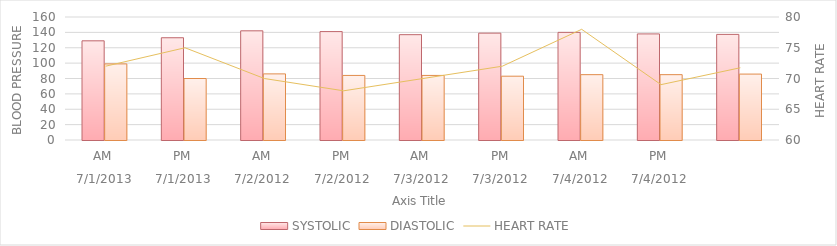
| Category | SYSTOLIC | DIASTOLIC |
|---|---|---|
| 0 | 129 | 99 |
| 1/1/00 | 133 | 80 |
| 1/2/00 | 142 | 86 |
| 1/3/00 | 141 | 84 |
| 1/4/00 | 137 | 84 |
| 1/5/00 | 139 | 83 |
| 1/6/00 | 140 | 85 |
| 1/7/00 | 138 | 85 |